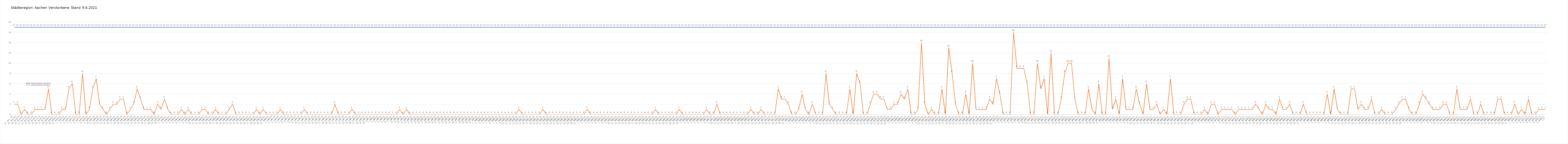
| Category | Verstorbene gesamt | Verstorbene Corona |
|---|---|---|
| 0 | 17 | 2 |
| 1 | 17 | 2 |
| 2 | 17 | 0 |
| 3 | 17 | 1 |
| 4 | 17 | 0 |
| 5 | 17 | 0 |
| 6 | 17 | 1 |
| 7 | 17 | 1 |
| 8 | 17 | 1 |
| 9 | 17 | 1 |
| 10 | 17 | 5 |
| 11 | 17 | 0 |
| 12 | 17 | 0 |
| 13 | 17 | 0 |
| 14 | 17 | 1 |
| 15 | 17 | 1 |
| 16 | 17 | 5 |
| 17 | 17 | 6 |
| 18 | 17 | 0 |
| 19 | 17 | 0 |
| 20 | 17 | 8 |
| 21 | 17 | 0 |
| 22 | 17 | 1 |
| 23 | 17 | 5 |
| 24 | 17 | 7 |
| 25 | 17 | 2 |
| 26 | 17 | 1 |
| 27 | 17 | 0 |
| 28 | 17 | 1 |
| 29 | 17 | 2 |
| 30 | 17 | 2 |
| 31 | 17 | 3 |
| 32 | 17 | 3 |
| 33 | 17 | 0 |
| 34 | 17 | 1 |
| 35 | 17 | 2 |
| 36 | 17 | 5 |
| 37 | 17 | 3 |
| 38 | 17 | 1 |
| 39 | 17 | 1 |
| 40 | 17 | 1 |
| 41 | 17 | 0 |
| 42 | 17 | 2 |
| 43 | 17 | 1 |
| 44 | 17 | 3 |
| 45 | 17 | 1 |
| 46 | 17 | 0 |
| 47 | 17 | 0 |
| 48 | 17 | 0 |
| 49 | 17 | 1 |
| 50 | 17 | 0 |
| 51 | 17 | 1 |
| 52 | 17 | 0 |
| 53 | 17 | 0 |
| 54 | 17 | 0 |
| 55 | 17 | 1 |
| 56 | 17 | 1 |
| 57 | 17 | 0 |
| 58 | 17 | 0 |
| 59 | 17 | 1 |
| 60 | 17 | 0 |
| 61 | 17 | 0 |
| 62 | 17 | 0 |
| 63 | 17 | 1 |
| 64 | 17 | 2 |
| 65 | 17 | 0 |
| 66 | 17 | 0 |
| 67 | 17 | 0 |
| 68 | 17 | 0 |
| 69 | 17 | 0 |
| 70 | 17 | 0 |
| 71 | 17 | 1 |
| 72 | 17 | 0 |
| 73 | 17 | 1 |
| 74 | 17 | 0 |
| 75 | 17 | 0 |
| 76 | 17 | 0 |
| 77 | 17 | 0 |
| 78 | 17 | 1 |
| 79 | 17 | 0 |
| 80 | 17 | 0 |
| 81 | 17 | 0 |
| 82 | 17 | 0 |
| 83 | 17 | 0 |
| 84 | 17 | 0 |
| 85 | 17 | 1 |
| 86 | 17 | 0 |
| 87 | 17 | 0 |
| 88 | 17 | 0 |
| 89 | 17 | 0 |
| 90 | 17 | 0 |
| 91 | 17 | 0 |
| 92 | 17 | 0 |
| 93 | 17 | 0 |
| 94 | 17 | 2 |
| 95 | 17 | 0 |
| 96 | 17 | 0 |
| 97 | 17 | 0 |
| 98 | 17 | 0 |
| 99 | 17 | 1 |
| 100 | 17 | 0 |
| 101 | 17 | 0 |
| 102 | 17 | 0 |
| 103 | 17 | 0 |
| 104 | 17 | 0 |
| 105 | 17 | 0 |
| 106 | 17 | 0 |
| 107 | 17 | 0 |
| 108 | 17 | 0 |
| 109 | 17 | 0 |
| 110 | 17 | 0 |
| 111 | 17 | 0 |
| 112 | 17 | 0 |
| 113 | 17 | 1 |
| 114 | 17 | 0 |
| 115 | 17 | 1 |
| 116 | 17 | 0 |
| 117 | 17 | 0 |
| 118 | 17 | 0 |
| 119 | 17 | 0 |
| 120 | 17 | 0 |
| 121 | 17 | 0 |
| 122 | 17 | 0 |
| 123 | 17 | 0 |
| 124 | 17 | 0 |
| 125 | 17 | 0 |
| 126 | 17 | 0 |
| 127 | 17 | 0 |
| 128 | 17 | 0 |
| 129 | 17 | 0 |
| 130 | 17 | 0 |
| 131 | 17 | 0 |
| 132 | 17 | 0 |
| 133 | 17 | 0 |
| 134 | 17 | 0 |
| 135 | 17 | 0 |
| 136 | 17 | 0 |
| 137 | 17 | 0 |
| 138 | 17 | 0 |
| 139 | 17 | 0 |
| 140 | 17 | 0 |
| 141 | 17 | 0 |
| 142 | 17 | 0 |
| 143 | 17 | 0 |
| 144 | 17 | 0 |
| 145 | 17 | 0 |
| 146 | 17 | 0 |
| 147 | 17 | 0 |
| 148 | 17 | 1 |
| 149 | 17 | 0 |
| 150 | 17 | 0 |
| 151 | 17 | 0 |
| 152 | 17 | 0 |
| 153 | 17 | 0 |
| 154 | 17 | 0 |
| 155 | 17 | 1 |
| 156 | 17 | 0 |
| 157 | 17 | 0 |
| 158 | 17 | 0 |
| 159 | 17 | 0 |
| 160 | 17 | 0 |
| 161 | 17 | 0 |
| 162 | 17 | 0 |
| 163 | 17 | 0 |
| 164 | 17 | 0 |
| 165 | 17 | 0 |
| 166 | 17 | 0 |
| 167 | 17 | 0 |
| 168 | 17 | 1 |
| 169 | 17 | 0 |
| 170 | 17 | 0 |
| 171 | 17 | 0 |
| 172 | 17 | 0 |
| 173 | 17 | 0 |
| 174 | 17 | 0 |
| 175 | 17 | 0 |
| 176 | 17 | 0 |
| 177 | 17 | 0 |
| 178 | 17 | 0 |
| 179 | 17 | 0 |
| 180 | 17 | 0 |
| 181 | 17 | 0 |
| 182 | 17 | 0 |
| 183 | 17 | 0 |
| 184 | 17 | 0 |
| 185 | 17 | 0 |
| 186 | 17 | 0 |
| 187 | 17 | 0 |
| 188 | 17 | 1 |
| 189 | 17 | 0 |
| 190 | 17 | 0 |
| 191 | 17 | 0 |
| 192 | 17 | 0 |
| 193 | 17 | 0 |
| 194 | 17 | 0 |
| 195 | 17 | 1 |
| 196 | 17 | 0 |
| 197 | 17 | 0 |
| 198 | 17 | 0 |
| 199 | 17 | 0 |
| 200 | 17 | 0 |
| 201 | 17 | 0 |
| 202 | 17 | 0 |
| 203 | 17 | 1 |
| 204 | 17 | 0 |
| 205 | 17 | 0 |
| 206 | 17 | 2 |
| 207 | 17 | 0 |
| 208 | 17 | 0 |
| 209 | 17 | 0 |
| 210 | 17 | 0 |
| 211 | 17 | 0 |
| 212 | 17 | 0 |
| 213 | 17 | 0 |
| 214 | 17 | 0 |
| 215 | 17 | 0 |
| 216 | 17 | 1 |
| 217 | 17 | 0 |
| 218 | 17 | 0 |
| 219 | 17 | 1 |
| 220 | 17 | 0 |
| 221 | 17 | 0 |
| 222 | 17 | 0 |
| 223 | 17 | 0 |
| 224 | 17 | 5 |
| 225 | 17 | 3 |
| 226 | 17 | 3 |
| 227 | 17 | 2 |
| 228 | 17 | 0 |
| 229 | 17 | 0 |
| 230 | 17 | 1 |
| 231 | 17 | 4 |
| 232 | 17 | 1 |
| 233 | 17 | 0 |
| 234 | 17 | 2 |
| 235 | 17 | 0 |
| 236 | 17 | 0 |
| 237 | 17 | 0 |
| 238 | 17 | 8 |
| 239 | 17 | 2 |
| 240 | 17 | 1 |
| 241 | 17 | 0 |
| 242 | 17 | 0 |
| 243 | 17 | 0 |
| 244 | 17 | 0 |
| 245 | 17 | 5 |
| 246 | 17 | 0 |
| 247 | 17 | 8 |
| 248 | 17 | 6 |
| 249 | 17 | 0 |
| 250 | 17 | 0 |
| 251 | 17 | 2 |
| 252 | 17 | 4 |
| 253 | 17 | 4 |
| 254 | 17 | 3 |
| 255 | 17 | 3 |
| 256 | 17 | 1 |
| 257 | 17 | 1 |
| 258 | 17 | 2 |
| 259 | 17 | 2 |
| 260 | 17 | 4 |
| 261 | 17 | 3 |
| 262 | 17 | 5 |
| 263 | 17 | 0 |
| 264 | 17 | 0 |
| 265 | 17 | 1 |
| 266 | 17 | 14 |
| 267 | 17 | 2 |
| 268 | 17 | 0 |
| 269 | 17 | 1 |
| 270 | 17 | 0 |
| 271 | 17 | 0 |
| 272 | 17 | 5 |
| 273 | 17 | 0 |
| 274 | 17 | 13 |
| 275 | 17 | 8 |
| 276 | 17 | 2 |
| 277 | 17 | 0 |
| 278 | 17 | 0 |
| 279 | 17 | 4 |
| 280 | 17 | 0 |
| 281 | 17 | 10 |
| 282 | 17 | 1 |
| 283 | 17 | 1 |
| 284 | 17 | 1 |
| 285 | 17 | 1 |
| 286 | 17 | 3 |
| 287 | 17 | 2 |
| 288 | 17 | 7 |
| 289 | 17 | 4 |
| 290 | 17 | 0 |
| 291 | 17 | 0 |
| 292 | 17 | 0 |
| 293 | 17 | 16 |
| 294 | 17 | 9 |
| 295 | 17 | 9 |
| 296 | 17 | 9 |
| 297 | 17 | 6 |
| 298 | 17 | 0 |
| 299 | 17 | 0 |
| 300 | 17 | 10 |
| 301 | 17 | 5 |
| 302 | 17 | 7 |
| 303 | 17 | 0 |
| 304 | 17 | 12 |
| 305 | 17 | 0 |
| 306 | 17 | 0 |
| 307 | 17 | 3 |
| 308 | 17 | 8 |
| 309 | 17 | 10 |
| 310 | 17 | 10 |
| 311 | 17 | 3 |
| 312 | 17 | 0 |
| 313 | 17 | 0 |
| 314 | 17 | 0 |
| 315 | 17 | 5 |
| 316 | 17 | 1 |
| 317 | 17 | 0 |
| 318 | 17 | 6 |
| 319 | 17 | 0 |
| 320 | 17 | 0 |
| 321 | 17 | 11 |
| 322 | 17 | 1 |
| 323 | 17 | 3 |
| 324 | 17 | 0 |
| 325 | 17 | 7 |
| 326 | 17 | 1 |
| 327 | 17 | 1 |
| 328 | 17 | 1 |
| 329 | 17 | 5 |
| 330 | 17 | 2 |
| 331 | 17 | 0 |
| 332 | 17 | 6 |
| 333 | 17 | 1 |
| 334 | 17 | 1 |
| 335 | 17 | 2 |
| 336 | 17 | 0 |
| 337 | 17 | 1 |
| 338 | 17 | 0 |
| 339 | 17 | 7 |
| 340 | 17 | 0 |
| 341 | 17 | 0 |
| 342 | 17 | 0 |
| 343 | 17 | 2 |
| 344 | 17 | 3 |
| 345 | 17 | 3 |
| 346 | 17 | 0 |
| 347 | 17 | 0 |
| 348 | 17 | 0 |
| 349 | 17 | 1 |
| 350 | 17 | 0 |
| 351 | 17 | 2 |
| 352 | 17 | 2 |
| 353 | 17 | 0 |
| 354 | 17 | 1 |
| 355 | 17 | 1 |
| 356 | 17 | 1 |
| 357 | 17 | 1 |
| 358 | 17 | 0 |
| 359 | 17 | 1 |
| 360 | 17 | 1 |
| 361 | 17 | 1 |
| 362 | 17 | 1 |
| 363 | 17 | 1 |
| 364 | 17 | 2 |
| 365 | 17 | 1 |
| 366 | 17 | 0 |
| 367 | 17 | 2 |
| 368 | 17 | 1 |
| 369 | 17 | 1 |
| 370 | 17 | 0 |
| 371 | 17 | 3 |
| 372 | 17 | 1 |
| 373 | 17 | 1 |
| 374 | 17 | 2 |
| 375 | 17 | 0 |
| 376 | 17 | 0 |
| 377 | 17 | 0 |
| 378 | 17 | 2 |
| 379 | 17 | 0 |
| 380 | 17 | 0 |
| 381 | 17 | 0 |
| 382 | 17 | 0 |
| 383 | 17 | 0 |
| 384 | 17 | 0 |
| 385 | 17 | 4 |
| 386 | 17 | 0 |
| 387 | 17 | 5 |
| 388 | 17 | 1 |
| 389 | 17 | 0 |
| 390 | 17 | 0 |
| 391 | 17 | 0 |
| 392 | 17 | 5 |
| 393 | 17 | 5 |
| 394 | 17 | 1 |
| 395 | 17 | 2 |
| 396 | 17 | 1 |
| 397 | 17 | 1 |
| 398 | 17 | 3 |
| 399 | 17 | 0 |
| 400 | 17 | 0 |
| 401 | 17 | 1 |
| 402 | 17 | 0 |
| 403 | 17 | 0 |
| 404 | 17 | 0 |
| 405 | 17 | 1 |
| 406 | 17 | 2 |
| 407 | 17 | 3 |
| 408 | 17 | 3 |
| 409 | 17 | 1 |
| 410 | 17 | 0 |
| 411 | 17 | 0 |
| 412 | 17 | 2 |
| 413 | 17 | 4 |
| 414 | 17 | 3 |
| 415 | 17 | 2 |
| 416 | 17 | 1 |
| 417 | 17 | 1 |
| 418 | 17 | 1 |
| 419 | 17 | 2 |
| 420 | 17 | 2 |
| 421 | 17 | 0 |
| 422 | 17 | 0 |
| 423 | 17 | 5 |
| 424 | 17 | 1 |
| 425 | 17 | 1 |
| 426 | 17 | 1 |
| 427 | 17 | 3 |
| 428 | 17 | 0 |
| 429 | 17 | 0 |
| 430 | 17 | 2 |
| 431 | 17 | 0 |
| 432 | 17 | 0 |
| 433 | 17 | 0 |
| 434 | 17 | 0 |
| 435 | 17 | 3 |
| 436 | 17 | 3 |
| 437 | 17 | 0 |
| 438 | 17 | 0 |
| 439 | 17 | 0 |
| 440 | 17 | 2 |
| 441 | 17 | 0 |
| 442 | 17 | 1 |
| 443 | 17 | 0 |
| 444 | 17 | 3 |
| 445 | 17 | 0 |
| 446 | 17 | 0 |
| 447 | 17 | 1 |
| 448 | 17 | 1 |
| 449 | 17 | 1 |